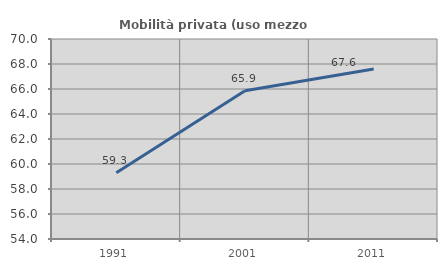
| Category | Mobilità privata (uso mezzo privato) |
|---|---|
| 1991.0 | 59.294 |
| 2001.0 | 65.86 |
| 2011.0 | 67.594 |